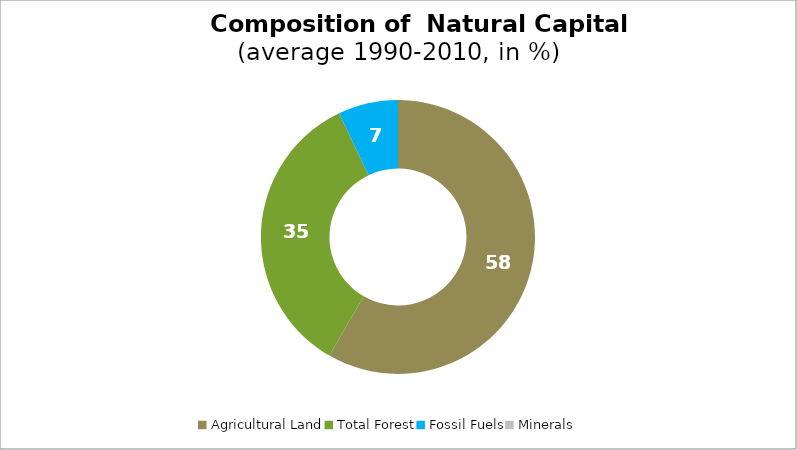
| Category | Series 0 |
|---|---|
| Agricultural Land | 58.338 |
| Total Forest | 34.593 |
| Fossil Fuels | 7.069 |
| Minerals | 0 |